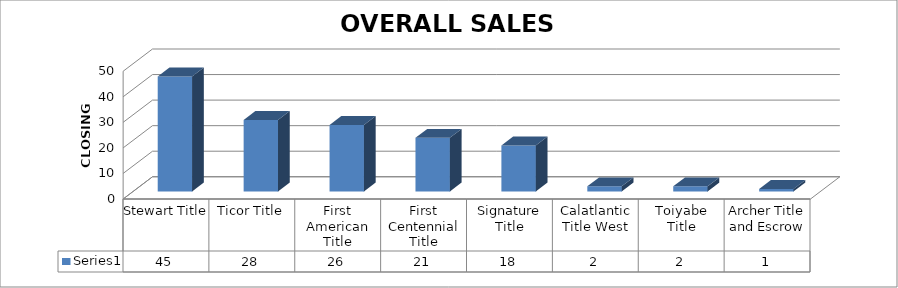
| Category | Series 0 |
|---|---|
| Stewart Title | 45 |
| Ticor Title | 28 |
| First American Title | 26 |
| First Centennial Title | 21 |
| Signature Title | 18 |
| Calatlantic Title West | 2 |
| Toiyabe Title | 2 |
| Archer Title and Escrow | 1 |